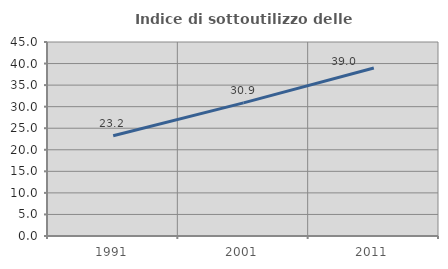
| Category | Indice di sottoutilizzo delle abitazioni  |
|---|---|
| 1991.0 | 23.243 |
| 2001.0 | 30.888 |
| 2011.0 | 38.967 |